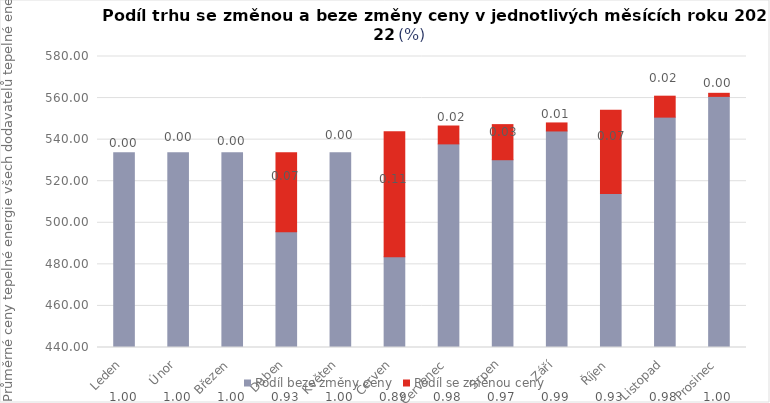
| Category | Podíl beze změny ceny | Podíl se změnou ceny |
|---|---|---|
| Leden | 533.733 | 0 |
| Únor | 533.733 | 0 |
| Březen | 533.733 | 0 |
| Duben | 495.745 | 37.991 |
| Květen | 533.736 | 0 |
| Červen | 483.646 | 60.128 |
| Červenec | 537.963 | 8.598 |
| Srpen | 530.341 | 16.889 |
| Září | 544.175 | 3.862 |
| Říjen | 514.081 | 40.002 |
| Listopad | 550.833 | 10.076 |
| Prosinec | 560.808 | 1.48 |